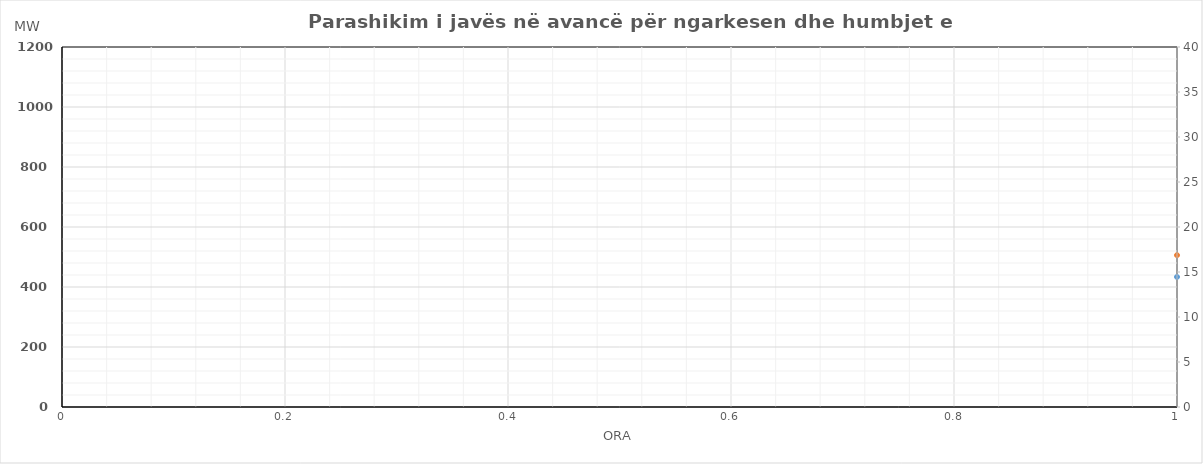
| Category | Ngarkesa (MWh) |
|---|---|
| 0 | 506.129 |
| 1 | 476.587 |
| 2 | 465.609 |
| 3 | 456.712 |
| 4 | 473.941 |
| 5 | 542.227 |
| 6 | 661.147 |
| 7 | 797.313 |
| 8 | 803.432 |
| 9 | 777.69 |
| 10 | 744.91 |
| 11 | 734.193 |
| 12 | 730.312 |
| 13 | 757.409 |
| 14 | 794.633 |
| 15 | 808.089 |
| 16 | 868.465 |
| 17 | 969.352 |
| 18 | 958.439 |
| 19 | 930.503 |
| 20 | 882.314 |
| 21 | 786.771 |
| 22 | 683.62 |
| 23 | 592.808 |
| 24 | 520.338 |
| 25 | 480.903 |
| 26 | 473.712 |
| 27 | 476.324 |
| 28 | 492.531 |
| 29 | 556.189 |
| 30 | 714.49 |
| 31 | 853.069 |
| 32 | 861.265 |
| 33 | 834.559 |
| 34 | 769.704 |
| 35 | 762.845 |
| 36 | 753.915 |
| 37 | 773.683 |
| 38 | 817.053 |
| 39 | 830.323 |
| 40 | 872.902 |
| 41 | 975.929 |
| 42 | 968.021 |
| 43 | 933.242 |
| 44 | 874.393 |
| 45 | 793.697 |
| 46 | 690.021 |
| 47 | 588.195 |
| 48 | 528.042 |
| 49 | 491.682 |
| 50 | 461.333 |
| 51 | 474.184 |
| 52 | 491.788 |
| 53 | 553.622 |
| 54 | 704.43 |
| 55 | 846.072 |
| 56 | 849.583 |
| 57 | 835.63 |
| 58 | 796.865 |
| 59 | 779.156 |
| 60 | 774.882 |
| 61 | 803.826 |
| 62 | 847.91 |
| 63 | 856.907 |
| 64 | 894.029 |
| 65 | 974.833 |
| 66 | 960.727 |
| 67 | 922.813 |
| 68 | 878.555 |
| 69 | 789.594 |
| 70 | 689.186 |
| 71 | 595.794 |
| 72 | 531.46 |
| 73 | 492.218 |
| 74 | 482.29 |
| 75 | 473.551 |
| 76 | 486.343 |
| 77 | 537.082 |
| 78 | 636.084 |
| 79 | 784.929 |
| 80 | 894.863 |
| 81 | 941.929 |
| 82 | 947.982 |
| 83 | 943.346 |
| 84 | 958.342 |
| 85 | 948.975 |
| 86 | 928.748 |
| 87 | 915.257 |
| 88 | 954.857 |
| 89 | 1002.023 |
| 90 | 963.302 |
| 91 | 926.321 |
| 92 | 875.198 |
| 93 | 795.719 |
| 94 | 684.471 |
| 95 | 599.214 |
| 96 | 535.06 |
| 97 | 505.299 |
| 98 | 484.75 |
| 99 | 472.601 |
| 100 | 481.641 |
| 101 | 521.09 |
| 102 | 597.267 |
| 103 | 729.5 |
| 104 | 829.091 |
| 105 | 857.787 |
| 106 | 850.144 |
| 107 | 840.515 |
| 108 | 843.791 |
| 109 | 845.355 |
| 110 | 839.824 |
| 111 | 841.775 |
| 112 | 895.434 |
| 113 | 999.503 |
| 114 | 993.801 |
| 115 | 964.666 |
| 116 | 915.523 |
| 117 | 819.973 |
| 118 | 705.591 |
| 119 | 601.668 |
| 120 | 532.316 |
| 121 | 488.293 |
| 122 | 465.877 |
| 123 | 465.117 |
| 124 | 482.258 |
| 125 | 545.086 |
| 126 | 700.286 |
| 127 | 854.743 |
| 128 | 872.854 |
| 129 | 859.586 |
| 130 | 799.78 |
| 131 | 785.412 |
| 132 | 774.762 |
| 133 | 792.598 |
| 134 | 833.962 |
| 135 | 848.789 |
| 136 | 889.509 |
| 137 | 994.63 |
| 138 | 983.279 |
| 139 | 951.055 |
| 140 | 909.8 |
| 141 | 810.117 |
| 142 | 707.355 |
| 143 | 605.292 |
| 144 | 537.994 |
| 145 | 498.816 |
| 146 | 482.223 |
| 147 | 479.86 |
| 148 | 488.49 |
| 149 | 555.194 |
| 150 | 701.778 |
| 151 | 866.776 |
| 152 | 886.603 |
| 153 | 863.196 |
| 154 | 812.016 |
| 155 | 782.976 |
| 156 | 769.57 |
| 157 | 789.842 |
| 158 | 838.575 |
| 159 | 865.258 |
| 160 | 921.634 |
| 161 | 1026.876 |
| 162 | 1018.255 |
| 163 | 989.691 |
| 164 | 935.886 |
| 165 | 849.433 |
| 166 | 744.327 |
| 167 | 631.582 |